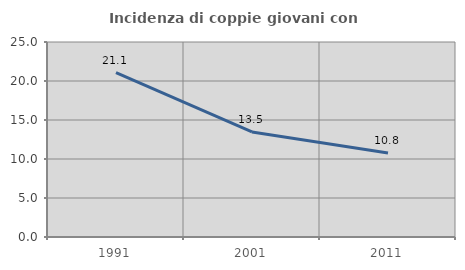
| Category | Incidenza di coppie giovani con figli |
|---|---|
| 1991.0 | 21.086 |
| 2001.0 | 13.471 |
| 2011.0 | 10.769 |